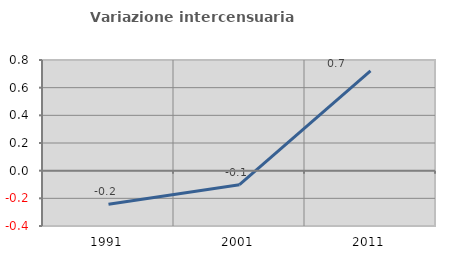
| Category | Variazione intercensuaria annua |
|---|---|
| 1991.0 | -0.243 |
| 2001.0 | -0.101 |
| 2011.0 | 0.722 |